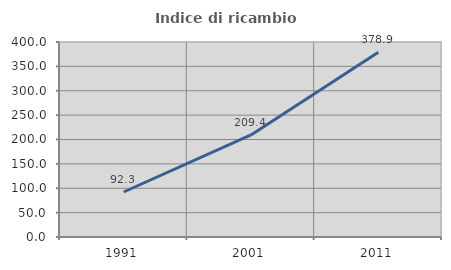
| Category | Indice di ricambio occupazionale  |
|---|---|
| 1991.0 | 92.308 |
| 2001.0 | 209.375 |
| 2011.0 | 378.947 |